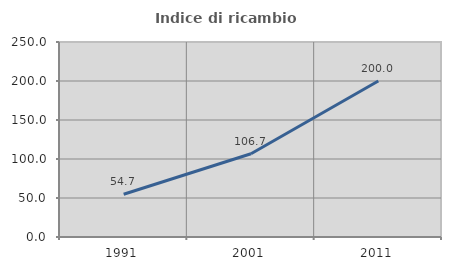
| Category | Indice di ricambio occupazionale  |
|---|---|
| 1991.0 | 54.749 |
| 2001.0 | 106.731 |
| 2011.0 | 200 |